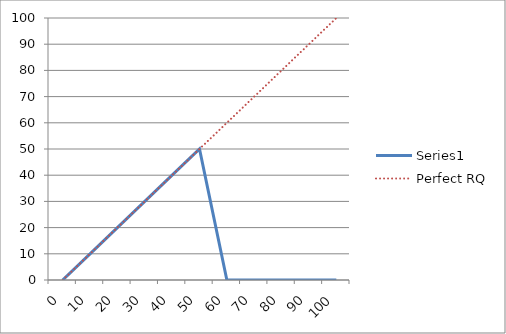
| Category | Series 0 | Perfect RQ |
|---|---|---|
| 0.0 | 0 | 0 |
| 10.0 | 10 | 10 |
| 20.0 | 20 | 20 |
| 30.0 | 30 | 30 |
| 40.0 | 40 | 40 |
| 50.0 | 50 | 50 |
| 60.0 | 0 | 60 |
| 70.0 | 0 | 70 |
| 80.0 | 0 | 80 |
| 90.0 | 0 | 90 |
| 100.0 | 0 | 100 |